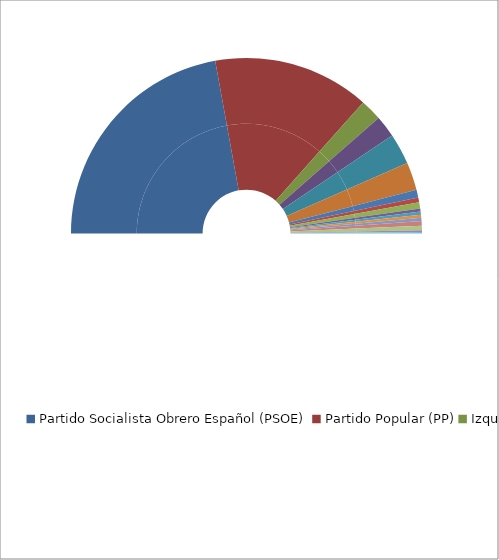
| Category | Series 0 | Series 1 |
|---|---|---|
| Partido Socialista Obrero Español (PSOE) | 155 | 44.286 |
| Partido Popular (PP) | 101 | 28.857 |
| Izquierda Unida (IU) | 14 | 4 |
| Centro Democrático y Social (CDS) | 14 | 4 |
| Partit dels Socialistes de Catalunya (PSC-PSOE) | 20 | 5.714 |
| Convergencia i Unió (CIU) | 18 | 5.143 |
| Eusko Alderdi Jetzalea - Partido Nacionalista Vasco (EAJ-PNV) | 5 | 1.429 |
| Iniciativa per Catalunya (IC) | 3 | 0.857 |
| Herri Batasuna (HB) | 4 | 1.143 |
| Partido Andalucista (PA) | 2 | 0.571 |
| Unión Valenciana (UV) | 2 | 0.571 |
| Eusko Alkartasuna (EA) | 2 | 0.571 |
| Euskadiko Ezkerra (EE) | 2 | 0.571 |
| Unión del Pueblo Navarro - Coalición PP (UPN-PP) | 3 | 0.857 |
| PP- Coalición Centristas de Galicia (PP-CG) | 3 | 0.857 |
| Partido Aragonés Regionalista (PAR) | 1 | 0.286 |
| Agrupaciones Independientes de Canarias (AIC) | 1 | 0.286 |